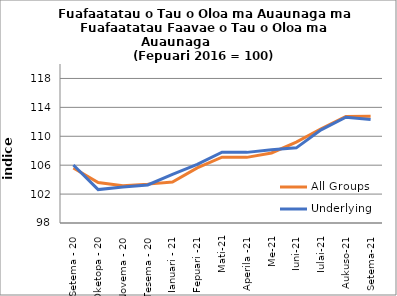
| Category | All Groups | Underlying |
|---|---|---|
| Setema - 20 | 105.614 | 106.027 |
| Oketopa - 20 | 103.588 | 102.619 |
| Novema - 20 | 103.171 | 102.969 |
| Tesema - 20 | 103.378 | 103.266 |
| Ianuari - 21 | 103.671 | 104.733 |
| Fepuari -21 | 105.627 | 106.099 |
| Mati-21 | 107.11 | 107.788 |
| Aperila -21 | 107.082 | 107.772 |
| Me-21 | 107.693 | 108.128 |
| Iuni-21 | 109.193 | 108.399 |
| Iulai-21 | 111.039 | 110.883 |
| Aukuso-21 | 112.735 | 112.633 |
| Setema-21 | 112.778 | 112.306 |